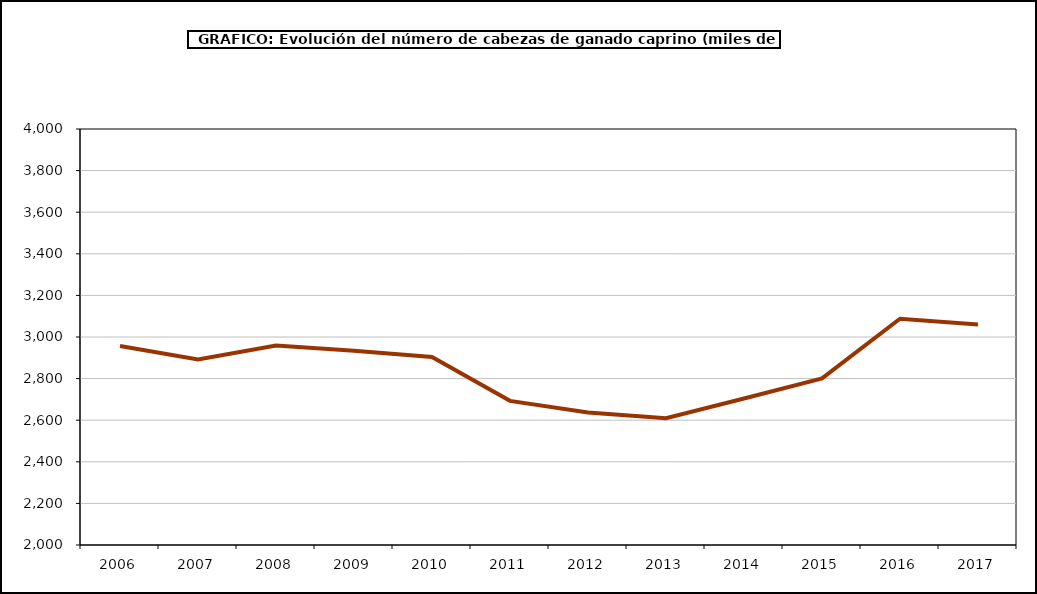
| Category | Total Ovino |
|---|---|
| 2006.0 | 2956.729 |
| 2007.0 | 2891.574 |
| 2008.0 | 2959.329 |
| 2009.0 | 2933.782 |
| 2010.0 | 2904 |
| 2011.0 | 2693 |
| 2012.0 | 2637.336 |
| 2013.0 | 2609.989 |
| 2014.0 | 2704.229 |
| 2015.0 | 2801.064 |
| 2016.0 | 3088.035 |
| 2017.0 | 3059.731 |